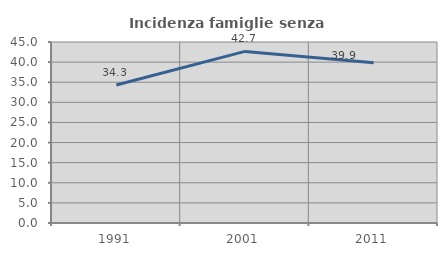
| Category | Incidenza famiglie senza nuclei |
|---|---|
| 1991.0 | 34.328 |
| 2001.0 | 42.667 |
| 2011.0 | 39.854 |